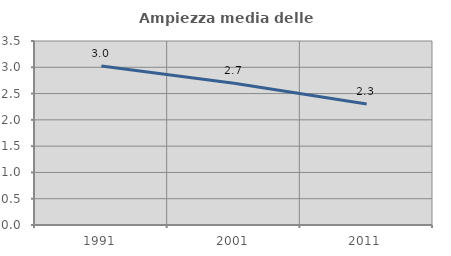
| Category | Ampiezza media delle famiglie |
|---|---|
| 1991.0 | 3.025 |
| 2001.0 | 2.697 |
| 2011.0 | 2.303 |